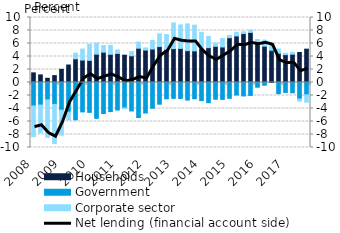
| Category | Households | Government | Corporate sector |
|---|---|---|---|
| 2008.0 | 1.482 | -3.614 | -4.726 |
| 2008.0 | 1.167 | -3.465 | -4.286 |
| 2008.0 | 0.647 | -2.667 | -5.769 |
| 2008.0 | 1.06 | -3.365 | -6.035 |
| 2009.0 | 2.022 | -4.26 | -3.85 |
| 2009.0 | 2.69 | -4.568 | -1.185 |
| 2009.0 | 3.646 | -5.737 | 0.861 |
| 2009.0 | 3.452 | -4.523 | 1.684 |
| 2010.0 | 3.403 | -4.596 | 2.463 |
| 2010.0 | 4.357 | -5.515 | 1.688 |
| 2010.0 | 4.662 | -4.769 | 1.012 |
| 2010.0 | 4.334 | -4.478 | 1.381 |
| 2011.0 | 4.471 | -4.232 | 0.537 |
| 2011.0 | 4.204 | -3.914 | -0.111 |
| 2011.0 | 4.109 | -4.378 | 0.654 |
| 2011.0 | 5.273 | -5.386 | 0.951 |
| 2012.0 | 4.99 | -4.694 | 0.332 |
| 2012.0 | 5.147 | -3.959 | 1.313 |
| 2012.0 | 5.529 | -3.339 | 1.965 |
| 2012.0 | 5.095 | -2.511 | 2.283 |
| 2013.0 | 5.217 | -2.438 | 3.935 |
| 2013.0 | 5.243 | -2.452 | 3.629 |
| 2013.0 | 4.902 | -2.704 | 4.105 |
| 2013.0 | 4.863 | -2.499 | 3.957 |
| 2014.0 | 5.255 | -2.784 | 2.466 |
| 2014.0 | 5.362 | -3.109 | 1.739 |
| 2014.0 | 5.569 | -2.575 | 0.494 |
| 2014.0 | 5.462 | -2.602 | 1.299 |
| 2015.0 | 6.893 | -2.428 | 0.355 |
| 2015.0 | 7.166 | -1.927 | 0.557 |
| 2015.0 | 7.531 | -2.068 | 0.277 |
| 2015.0 | 7.706 | -1.989 | 0.374 |
| 2016.0 | 5.929 | -0.728 | 0.691 |
| 2016.0 | 5.586 | -0.421 | 0.939 |
| 2016.0 | 4.885 | 0.128 | 0.799 |
| 2016.0 | 4.497 | -1.716 | 0.652 |
| 2017.0 | 4.289 | -1.527 | 0.212 |
| 2017.0 | 4.353 | -1.583 | 0.297 |
| 2017.0 | 4.616 | -2.543 | -0.327 |
| 2017.0 | 5.131 | -1.891 | -1.141 |